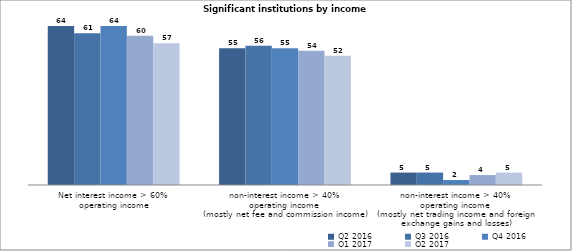
| Category | Q2 2016 | Q3 2016 | Q4 2016 | Q1 2017 | Q2 2017 |
|---|---|---|---|---|---|
| Net interest income > 60% 
operating income | 64 | 61 | 64 | 60 | 57 |
| non-interest income > 40% 
operating income 
(mostly net fee and commission income) | 55 | 56 | 55 | 54 | 52 |
| non-interest income > 40% 
operating income 
(mostly net trading income and foreign exchange gains and losses) | 5 | 5 | 2 | 4 | 5 |